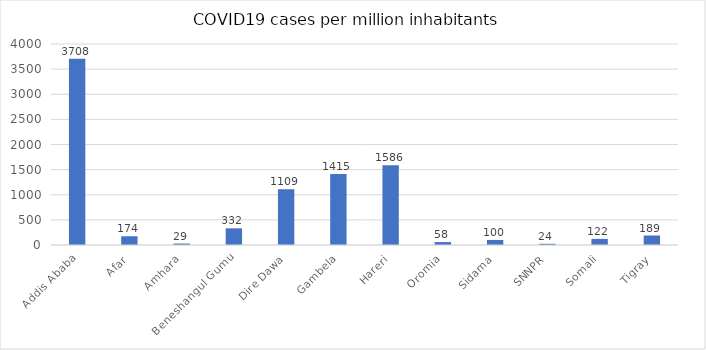
| Category | Case per million |
|---|---|
| Addis Ababa | 3708.266 |
| Afar | 173.665 |
| Amhara | 29.153 |
| Beneshangul Gumu | 331.637 |
| Dire Dawa | 1108.616 |
| Gambela | 1414.641 |
| Hareri | 1585.638 |
| Oromia | 58.237 |
| Sidama | 100.385 |
| SNNPR | 24.451 |
| Somali | 121.551 |
| Tigray | 188.804 |